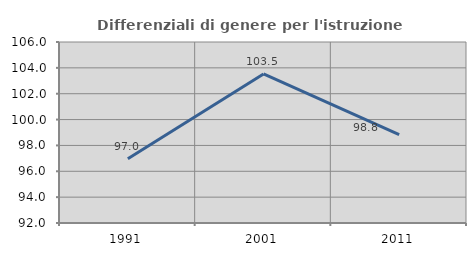
| Category | Differenziali di genere per l'istruzione superiore |
|---|---|
| 1991.0 | 96.969 |
| 2001.0 | 103.531 |
| 2011.0 | 98.828 |